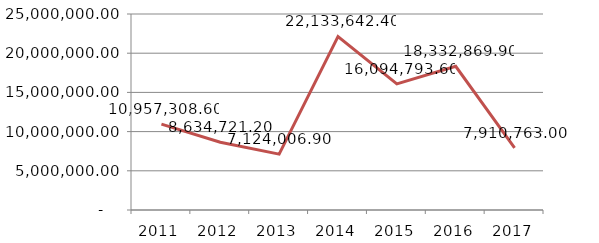
| Category | Valor dos contratos |
|---|---|
| 2011.0 | 10957308.6 |
| 2012.0 | 8634721.2 |
| 2013.0 | 7124006.9 |
| 2014.0 | 22133642.4 |
| 2015.0 | 16094793.6 |
| 2016.0 | 18332869.9 |
| 2017.0 | 7910763 |